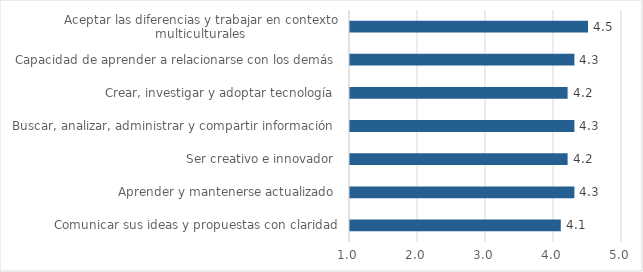
| Category | Series 5 | Promedio |
|---|---|---|
| Comunicar sus ideas y propuestas con claridad |  | 4.1 |
| Aprender y mantenerse actualizado  |  | 4.3 |
| Ser creativo e innovador  |  | 4.2 |
| Buscar, analizar, administrar y compartir información  |  | 4.3 |
| Crear, investigar y adoptar tecnología  |  | 4.2 |
| Capacidad de aprender a relacionarse con los demás  |  | 4.3 |
| Aceptar las diferencias y trabajar en contexto multiculturales  |  | 4.5 |